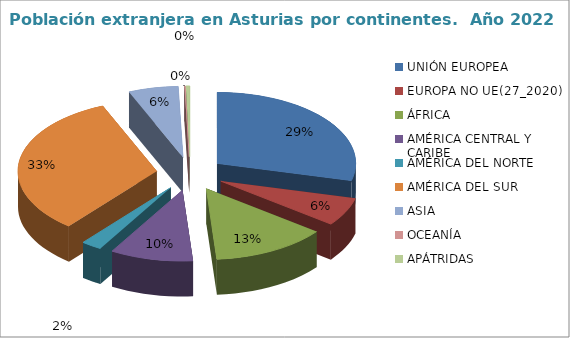
| Category | Series 0 |
|---|---|
| UNIÓN EUROPEA | 0.289 |
| EUROPA NO UE(27_2020) | 0.065 |
| ÁFRICA | 0.134 |
| AMÉRICA CENTRAL Y CARIBE | 0.097 |
| AMÉRICA DEL NORTE | 0.024 |
| AMÉRICA DEL SUR | 0.327 |
| ASIA | 0.058 |
| OCEANÍA | 0.001 |
| APÁTRIDAS | 0.005 |